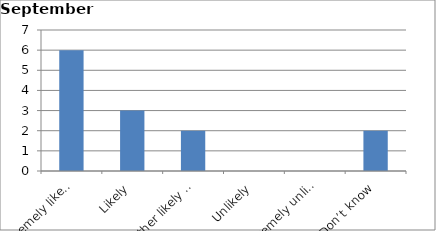
| Category | Series 0 |
|---|---|
| Extremely likely | 6 |
| Likely | 3 |
| Neither likely nor unlikely | 2 |
| Unlikely | 0 |
| Extremely unlikely | 0 |
| Don’t know | 2 |